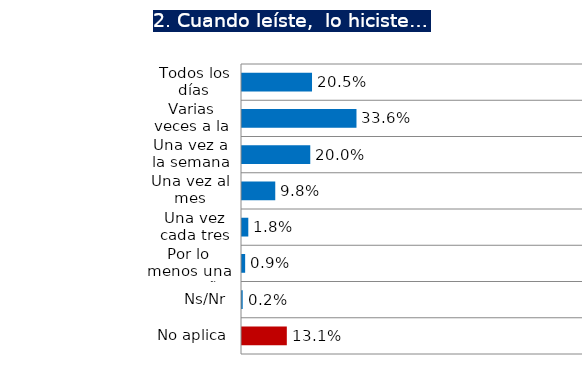
| Category | Series 0 |
|---|---|
| Todos los días | 0.205 |
| Varias veces a la semana | 0.336 |
| Una vez a la semana | 0.2 |
| Una vez al mes | 0.098 |
| Una vez cada tres meses | 0.018 |
| Por lo menos una vez al año | 0.009 |
| Ns/Nr | 0.002 |
| No aplica | 0.131 |